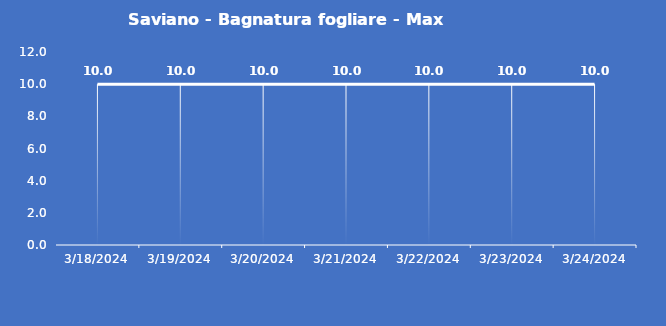
| Category | Saviano - Bagnatura fogliare - Max (min) |
|---|---|
| 3/18/24 | 10 |
| 3/19/24 | 10 |
| 3/20/24 | 10 |
| 3/21/24 | 10 |
| 3/22/24 | 10 |
| 3/23/24 | 10 |
| 3/24/24 | 10 |